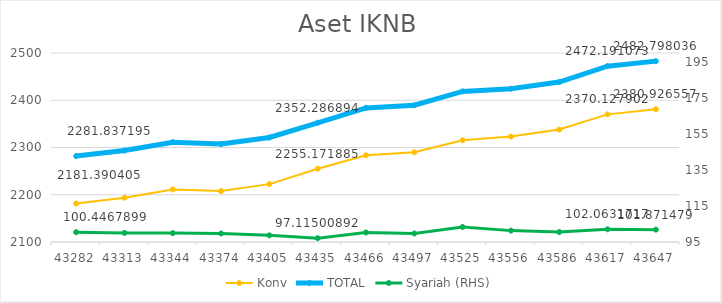
| Category | Konv | TOTAL |
|---|---|---|
| 43282.0 | 2181.39 | 2281.837 |
| 43313.0 | 2193.55 | 2293.599 |
| 43344.0 | 2211.208 | 2311.146 |
| 43374.0 | 2207.768 | 2307.509 |
| 43405.0 | 2222.478 | 2321.18 |
| 43435.0 | 2255.172 | 2352.287 |
| 43466.0 | 2283.536 | 2383.836 |
| 43497.0 | 2289.807 | 2389.536 |
| 43525.0 | 2315.383 | 2418.739 |
| 43556.0 | 2323.04 | 2424.36 |
| 43586.0 | 2338.007 | 2438.533 |
| 43617.0 | 2370.128 | 2472.191 |
| 43647.0 | 2380.927 | 2482.798 |